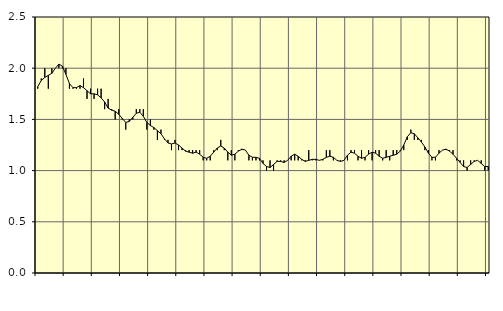
| Category | Piggar | Jordbruk, skogsbruk o fiske, SNI 01-03 |
|---|---|---|
| nan | 1.8 | 1.82 |
| 87.0 | 1.9 | 1.88 |
| 87.0 | 2 | 1.91 |
| 87.0 | 1.8 | 1.93 |
| nan | 2 | 1.95 |
| 88.0 | 2 | 2 |
| 88.0 | 2 | 2.04 |
| 88.0 | 2 | 2.02 |
| nan | 2 | 1.94 |
| 89.0 | 1.8 | 1.85 |
| 89.0 | 1.8 | 1.81 |
| 89.0 | 1.8 | 1.81 |
| nan | 1.8 | 1.83 |
| 90.0 | 1.9 | 1.81 |
| 90.0 | 1.7 | 1.78 |
| 90.0 | 1.8 | 1.75 |
| nan | 1.7 | 1.75 |
| 91.0 | 1.8 | 1.74 |
| 91.0 | 1.8 | 1.71 |
| 91.0 | 1.6 | 1.67 |
| nan | 1.7 | 1.61 |
| 92.0 | 1.6 | 1.59 |
| 92.0 | 1.5 | 1.58 |
| 92.0 | 1.6 | 1.55 |
| nan | 1.5 | 1.51 |
| 93.0 | 1.4 | 1.47 |
| 93.0 | 1.5 | 1.48 |
| 93.0 | 1.5 | 1.52 |
| nan | 1.6 | 1.56 |
| 94.0 | 1.6 | 1.57 |
| 94.0 | 1.6 | 1.53 |
| 94.0 | 1.4 | 1.47 |
| nan | 1.5 | 1.44 |
| 95.0 | 1.4 | 1.42 |
| 95.0 | 1.3 | 1.39 |
| 95.0 | 1.4 | 1.36 |
| nan | 1.3 | 1.31 |
| 96.0 | 1.3 | 1.27 |
| 96.0 | 1.2 | 1.26 |
| 96.0 | 1.3 | 1.27 |
| nan | 1.2 | 1.25 |
| 97.0 | 1.2 | 1.22 |
| 97.0 | 1.2 | 1.19 |
| 97.0 | 1.2 | 1.18 |
| nan | 1.2 | 1.17 |
| 98.0 | 1.2 | 1.18 |
| 98.0 | 1.2 | 1.16 |
| 98.0 | 1.1 | 1.13 |
| nan | 1.1 | 1.12 |
| 99.0 | 1.1 | 1.14 |
| 99.0 | 1.2 | 1.18 |
| 99.0 | 1.2 | 1.22 |
| nan | 1.3 | 1.24 |
| 0.0 | 1.2 | 1.22 |
| 0.0 | 1.1 | 1.18 |
| 0.0 | 1.2 | 1.15 |
| nan | 1.1 | 1.16 |
| 1.0 | 1.2 | 1.19 |
| 1.0 | 1.2 | 1.21 |
| 1.0 | 1.2 | 1.2 |
| nan | 1.1 | 1.15 |
| 2.0 | 1.1 | 1.13 |
| 2.0 | 1.1 | 1.13 |
| 2.0 | 1.1 | 1.12 |
| nan | 1.1 | 1.07 |
| 3.0 | 1 | 1.04 |
| 3.0 | 1.1 | 1.03 |
| 3.0 | 1 | 1.06 |
| nan | 1.1 | 1.09 |
| 4.0 | 1.1 | 1.09 |
| 4.0 | 1.1 | 1.08 |
| 4.0 | 1.1 | 1.1 |
| nan | 1.1 | 1.14 |
| 5.0 | 1.1 | 1.16 |
| 5.0 | 1.1 | 1.14 |
| 5.0 | 1.1 | 1.11 |
| nan | 1.1 | 1.09 |
| 6.0 | 1.2 | 1.1 |
| 6.0 | 1.1 | 1.11 |
| 6.0 | 1.1 | 1.11 |
| nan | 1.1 | 1.1 |
| 7.0 | 1.1 | 1.11 |
| 7.0 | 1.2 | 1.13 |
| 7.0 | 1.2 | 1.14 |
| nan | 1.1 | 1.13 |
| 8.0 | 1.1 | 1.1 |
| 8.0 | 1.1 | 1.09 |
| 8.0 | 1.1 | 1.1 |
| nan | 1.1 | 1.15 |
| 9.0 | 1.2 | 1.18 |
| 9.0 | 1.2 | 1.17 |
| 9.0 | 1.1 | 1.14 |
| nan | 1.2 | 1.12 |
| 10.0 | 1.1 | 1.13 |
| 10.0 | 1.2 | 1.16 |
| 10.0 | 1.1 | 1.18 |
| nan | 1.2 | 1.17 |
| 11.0 | 1.2 | 1.14 |
| 11.0 | 1.1 | 1.12 |
| 11.0 | 1.2 | 1.13 |
| nan | 1.1 | 1.14 |
| 12.0 | 1.2 | 1.15 |
| 12.0 | 1.2 | 1.16 |
| 12.0 | 1.2 | 1.19 |
| nan | 1.2 | 1.25 |
| 13.0 | 1.3 | 1.33 |
| 13.0 | 1.4 | 1.37 |
| 13.0 | 1.3 | 1.36 |
| nan | 1.3 | 1.32 |
| 14.0 | 1.3 | 1.28 |
| 14.0 | 1.2 | 1.23 |
| 14.0 | 1.2 | 1.17 |
| nan | 1.1 | 1.13 |
| 15.0 | 1.1 | 1.13 |
| 15.0 | 1.2 | 1.17 |
| 15.0 | 1.2 | 1.2 |
| nan | 1.2 | 1.21 |
| 16.0 | 1.2 | 1.19 |
| 16.0 | 1.2 | 1.16 |
| 16.0 | 1.1 | 1.12 |
| nan | 1.1 | 1.08 |
| 17.0 | 1.1 | 1.04 |
| 17.0 | 1 | 1.03 |
| 17.0 | 1.1 | 1.06 |
| nan | 1.1 | 1.09 |
| 18.0 | 1.1 | 1.1 |
| 18.0 | 1.1 | 1.07 |
| 18.0 | 1 | 1.04 |
| nan | 1 | 1.04 |